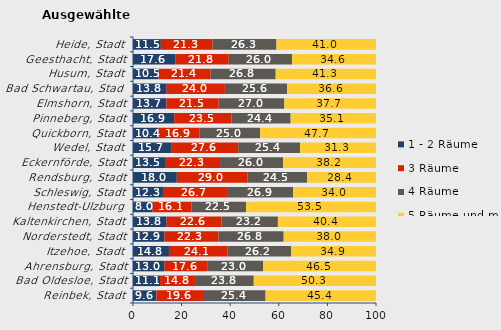
| Category | 1 - 2 Räume | 3 Räume | 4 Räume | 5 Räume und mehr |
|---|---|---|---|---|
| Reinbek, Stadt | 9.648 | 19.56 | 25.351 | 45.441 |
| Bad Oldesloe, Stadt | 11.139 | 14.768 | 23.788 | 50.305 |
| Ahrensburg, Stadt | 12.977 | 17.56 | 22.987 | 46.475 |
| Itzehoe, Stadt | 14.798 | 24.147 | 26.167 | 34.888 |
| Norderstedt, Stadt | 12.929 | 22.27 | 26.811 | 37.99 |
| Kaltenkirchen, Stadt | 13.836 | 22.58 | 23.214 | 40.371 |
| Henstedt-Ulzburg | 7.984 | 16.054 | 22.475 | 53.487 |
| Schleswig, Stadt | 12.333 | 26.739 | 26.893 | 34.034 |
| Rendsburg, Stadt | 18.022 | 29.036 | 24.547 | 28.396 |
| Eckernförde, Stadt | 13.513 | 22.303 | 25.995 | 38.189 |
| Wedel, Stadt | 15.673 | 27.607 | 25.441 | 31.279 |
| Quickborn, Stadt | 10.383 | 16.916 | 24.99 | 47.711 |
| Pinneberg, Stadt | 16.949 | 23.524 | 24.407 | 35.12 |
| Elmshorn, Stadt | 13.739 | 21.529 | 27.026 | 37.706 |
| Bad Schwartau, Stadt | 13.829 | 23.987 | 25.609 | 36.574 |
| Husum, Stadt | 10.524 | 21.399 | 26.801 | 41.277 |
| Geesthacht, Stadt | 17.555 | 21.843 | 26.026 | 34.576 |
| Heide, Stadt | 11.452 | 21.288 | 26.307 | 40.953 |